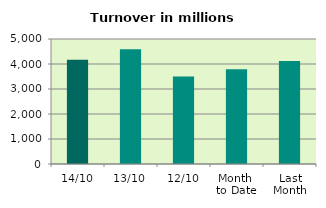
| Category | Series 0 |
|---|---|
| 14/10 | 4174.746 |
| 13/10 | 4588.275 |
| 12/10 | 3500.881 |
| Month 
to Date | 3792.716 |
| Last
Month | 4119.728 |